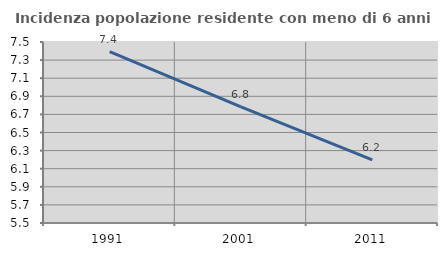
| Category | Incidenza popolazione residente con meno di 6 anni |
|---|---|
| 1991.0 | 7.393 |
| 2001.0 | 6.784 |
| 2011.0 | 6.197 |